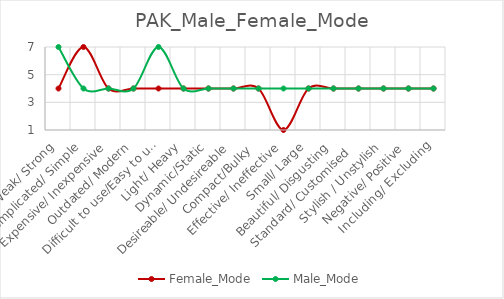
| Category | Female_Mode | Male_Mode |
|---|---|---|
| Weak/ Strong | 4 | 7 |
| Complicated/ Simple | 7 | 4 |
| Expensive/ Inexpensive | 4 | 4 |
| Outdated/ Modern | 4 | 4 |
| Difficult to use/Easy to use | 4 | 7 |
| Light/ Heavy | 4 | 4 |
| Dynamic/Static | 4 | 4 |
| Desireable/ Undesireable | 4 | 4 |
| Compact/Bulky  | 4 | 4 |
| Effective/ Ineffective | 1 | 4 |
| Small/ Large | 4 | 4 |
| Beautiful/ Disgusting | 4 | 4 |
| Standard/ Customised   | 4 | 4 |
| Stylish / Unstylish | 4 | 4 |
| Negative/ Positive | 4 | 4 |
| Including/ Excluding | 4 | 4 |